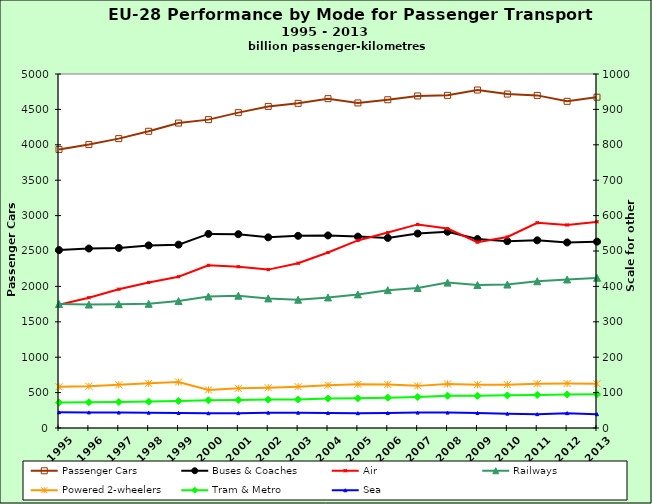
| Category | Passenger Cars |
|---|---|
| 1995.0 | 3934.847 |
| 1996.0 | 4002.989 |
| 1997.0 | 4087.17 |
| 1998.0 | 4191.022 |
| 1999.0 | 4306.813 |
| 2000.0 | 4355.422 |
| 2001.0 | 4454.199 |
| 2002.0 | 4542.342 |
| 2003.0 | 4585.563 |
| 2004.0 | 4651.571 |
| 2005.0 | 4591.316 |
| 2006.0 | 4636.342 |
| 2007.0 | 4690.041 |
| 2008.0 | 4698.437 |
| 2009.0 | 4773.794 |
| 2010.0 | 4716.808 |
| 2011.0 | 4697.828 |
| 2012.0 | 4614.083 |
| 2013.0 | 4672.264 |